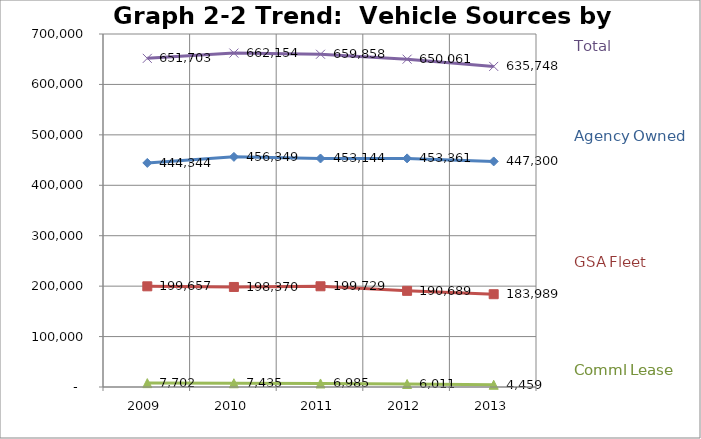
| Category | Owned GSA Leased Total | Series 1 | Series 2 | Series 3 |
|---|---|---|---|---|
| 2009.0 | 444344 | 199657 | 7702 | 651703 |
| 2010.0 | 456349 | 198370 | 7435 | 662154 |
| 2011.0 | 453144 | 199729 | 6985 | 659858 |
| 2012.0 | 453361 | 190689 | 6011 | 650061 |
| 2013.0 | 447300 | 183989 | 4459 | 635748 |